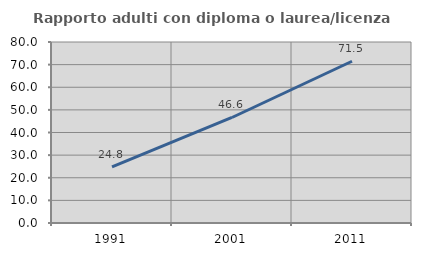
| Category | Rapporto adulti con diploma o laurea/licenza media  |
|---|---|
| 1991.0 | 24.771 |
| 2001.0 | 46.637 |
| 2011.0 | 71.495 |